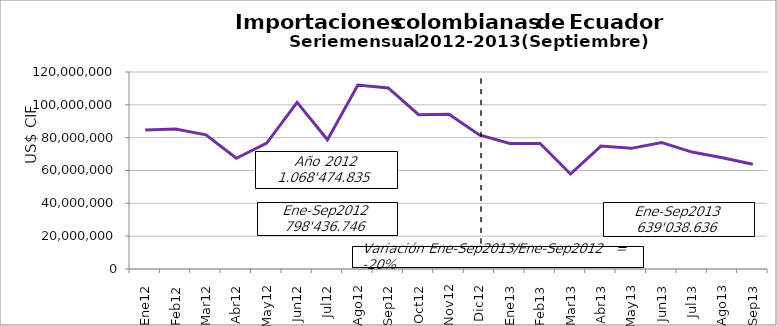
| Category | Series 0 |
|---|---|
| 0 | 84706126.24 |
| 1 | 85255888.76 |
| 2 | 81753738.03 |
| 3 | 67462503.2 |
| 4 | 76698924.06 |
| 5 | 101530636.7 |
| 6 | 78741586.2 |
| 7 | 112022428.72 |
| 8 | 110264913.75 |
| 9 | 94020212.94 |
| 10 | 94328476.66 |
| 11 | 81689399.62 |
| 12 | 76482504.23 |
| 13 | 76465271.26 |
| 14 | 57847665.95 |
| 15 | 74909485.43 |
| 16 | 73491245.71 |
| 17 | 77005386.13 |
| 18 | 71210291.19 |
| 19 | 67787400.63 |
| 20 | 63839385.44 |